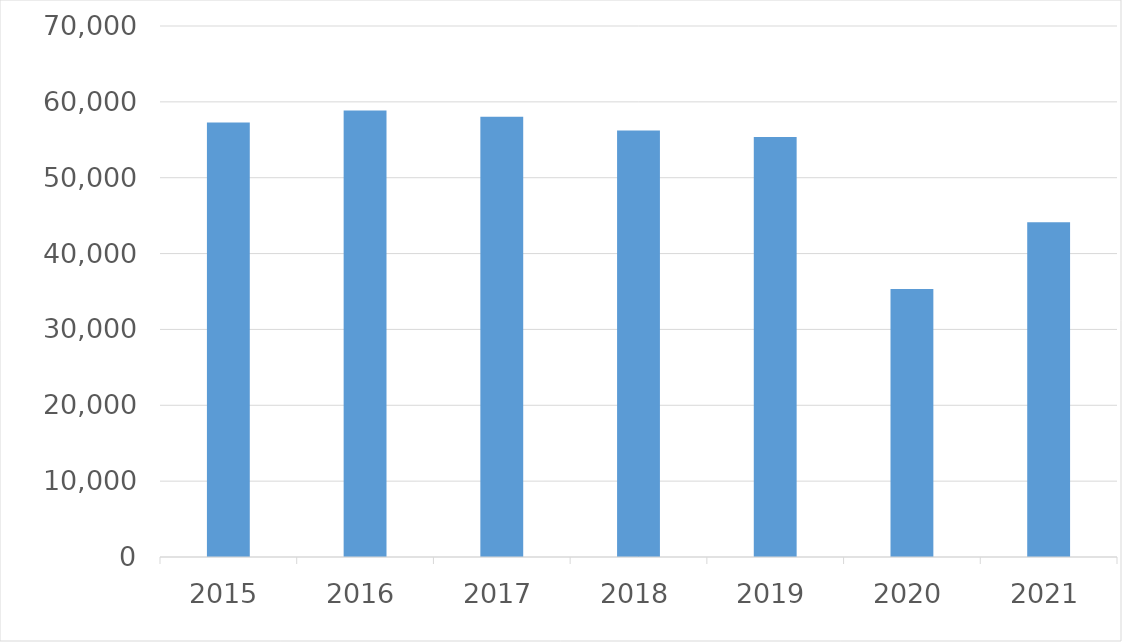
| Category | Series 0 |
|---|---|
| 2015 | 57272 |
| 2016 | 58861 |
| 2017 | 58025 |
| 2018 | 56231 |
| 2019 | 55353 |
| 2020 | 35315 |
| 2021 | 44124 |